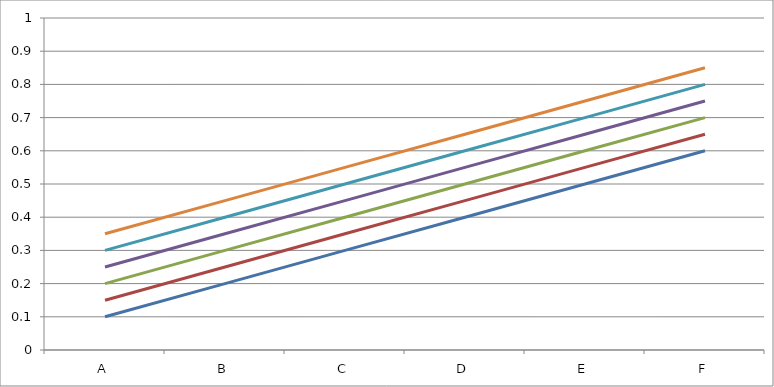
| Category | 2010 | 2011 | 2012 | 2013 | 2014 | 2015 |
|---|---|---|---|---|---|---|
| A | 0.1 | 0.15 | 0.2 | 0.25 | 0.3 | 0.35 |
| B | 0.2 | 0.25 | 0.3 | 0.35 | 0.4 | 0.45 |
| C | 0.3 | 0.35 | 0.4 | 0.45 | 0.5 | 0.55 |
| D | 0.4 | 0.45 | 0.5 | 0.55 | 0.6 | 0.65 |
| E | 0.5 | 0.55 | 0.6 | 0.65 | 0.7 | 0.75 |
| F | 0.6 | 0.65 | 0.7 | 0.75 | 0.8 | 0.85 |